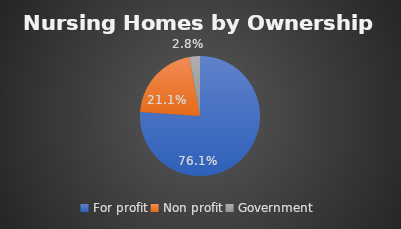
| Category | Series 0 |
|---|---|
| For profit | 0.761 |
| Non profit | 0.211 |
| Government | 0.028 |